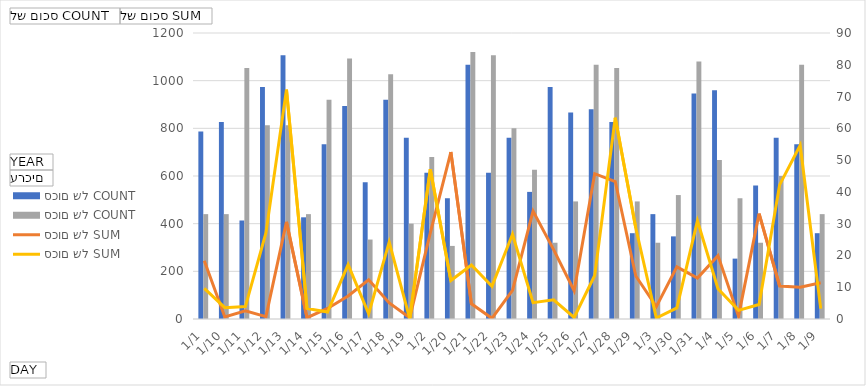
| Category | 2021 - סכום של COUNT | 2022 - סכום של COUNT |
|---|---|---|
| 1/1 | 59 | 33 |
| 1/10 | 62 | 33 |
| 1/11 | 31 | 79 |
| 1/12 | 73 | 61 |
| 1/13 | 83 | 61 |
| 1/14 | 32 | 33 |
| 1/15 | 55 | 69 |
| 1/16 | 67 | 82 |
| 1/17 | 43 | 25 |
| 1/18 | 69 | 77 |
| 1/19 | 57 | 30 |
| 1/2 | 46 | 51 |
| 1/20 | 38 | 23 |
| 1/21 | 80 | 84 |
| 1/22 | 46 | 83 |
| 1/23 | 57 | 60 |
| 1/24 | 40 | 47 |
| 1/25 | 73 | 24 |
| 1/26 | 65 | 37 |
| 1/27 | 66 | 80 |
| 1/28 | 62 | 79 |
| 1/29 | 27 | 37 |
| 1/3 | 33 | 24 |
| 1/30 | 26 | 39 |
| 1/31 | 71 | 81 |
| 1/4 | 72 | 50 |
| 1/5 | 19 | 38 |
| 1/6 | 42 | 24 |
| 1/7 | 57 | 45 |
| 1/8 | 55 | 80 |
| 1/9 | 27 | 33 |